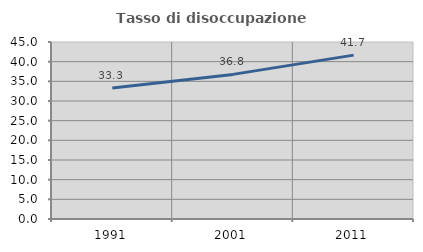
| Category | Tasso di disoccupazione giovanile  |
|---|---|
| 1991.0 | 33.333 |
| 2001.0 | 36.765 |
| 2011.0 | 41.667 |